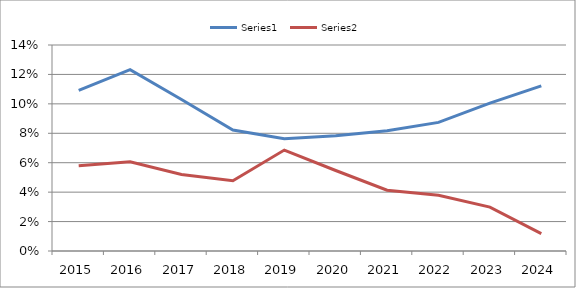
| Category | Series 0 | Series 1 |
|---|---|---|
| 2015.0 | 0.109 | 0.058 |
| 2016.0 | 0.123 | 0.061 |
| 2017.0 | 0.103 | 0.052 |
| 2018.0 | 0.082 | 0.048 |
| 2019.0 | 0.076 | 0.069 |
| 2020.0 | 0.078 | 0.055 |
| 2021.0 | 0.082 | 0.041 |
| 2022.0 | 0.087 | 0.038 |
| 2023.0 | 0.1 | 0.03 |
| 2024.0 | 0.112 | 0.012 |